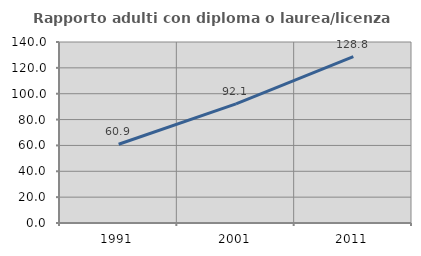
| Category | Rapporto adulti con diploma o laurea/licenza media  |
|---|---|
| 1991.0 | 60.895 |
| 2001.0 | 92.126 |
| 2011.0 | 128.771 |